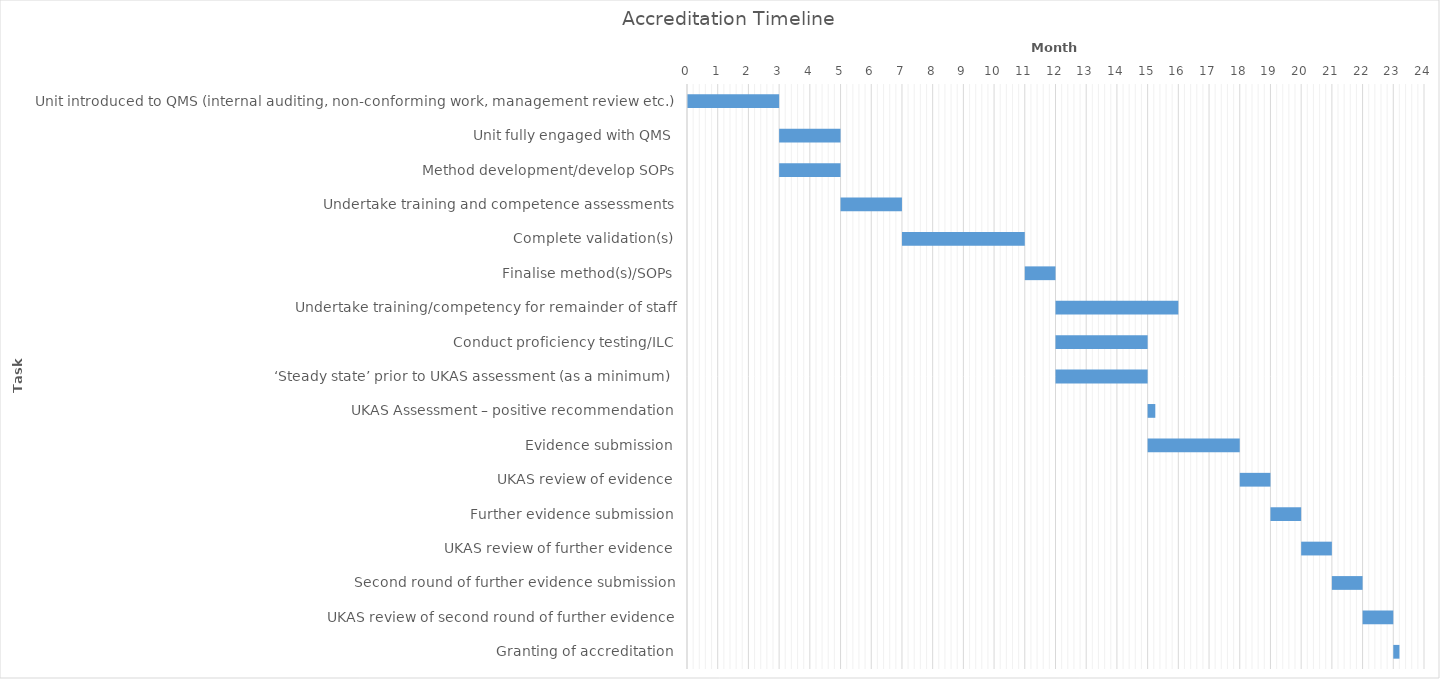
| Category | Start month | Number of Months to complete |
|---|---|---|
| Unit introduced to QMS (internal auditing, non-conforming work, management review etc.) | 0 | 3 |
| Unit fully engaged with QMS | 3 | 2 |
| Method development/develop SOPs | 3 | 2 |
| Undertake training and competence assessments | 5 | 2 |
| Complete validation(s) | 7 | 4 |
| Finalise method(s)/SOPs | 11 | 1 |
| Undertake training/competency for remainder of staff | 12 | 4 |
| Conduct proficiency testing/ILC | 12 | 3 |
| ‘Steady state’ prior to UKAS assessment (as a minimum) | 12 | 3 |
| UKAS Assessment – positive recommendation | 15 | 0.25 |
| Evidence submission | 15 | 3 |
| UKAS review of evidence | 18 | 1 |
| Further evidence submission | 19 | 1 |
| UKAS review of further evidence | 20 | 1 |
| Second round of further evidence submission | 21 | 1 |
| UKAS review of second round of further evidence | 22 | 1 |
| Granting of accreditation | 23 | 0.2 |